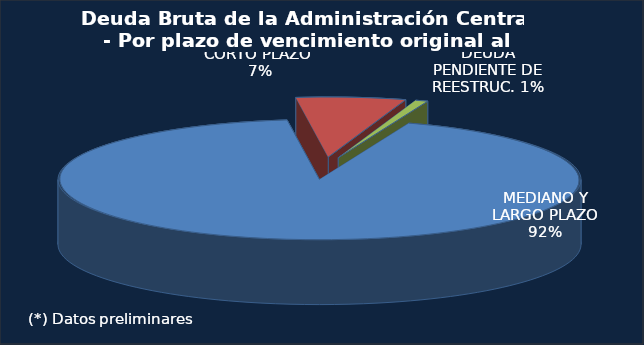
| Category | Series 0 |
|---|---|
| MEDIANO Y LARGO PLAZO | 310280 |
| CORTO PLAZO  | 22713 |
| DEUDA PENDIENTE DE REESTRUC. | 2566.5 |